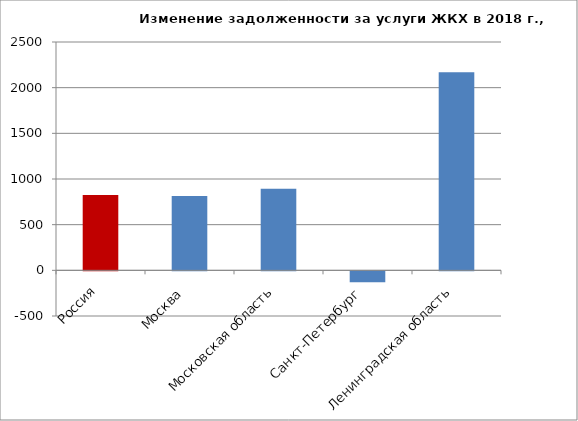
| Category | Изменение задолженности за услуги ЖКХ в 2018 г., руб./чел. |
|---|---|
| Россия | 825.838 |
| Москва  | 813.181 |
| Московская область | 894.126 |
| Санкт-Петербург  | -118.715 |
| Ленинградская область | 2167.898 |